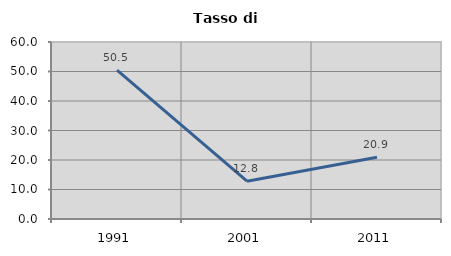
| Category | Tasso di disoccupazione   |
|---|---|
| 1991.0 | 50.472 |
| 2001.0 | 12.821 |
| 2011.0 | 20.942 |